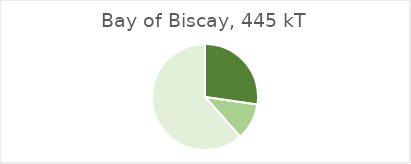
| Category | Bay of Biscay |
|---|---|
| Landings of assessed stocks for which adequate information is available to determine GES for F and/or SSB | 121321.271 |
| Landings of assessed stocks for which insufficient information is available to determine GES for F and/or SSB | 49969.77 |
| Landings unassessed stocks | 273891.719 |